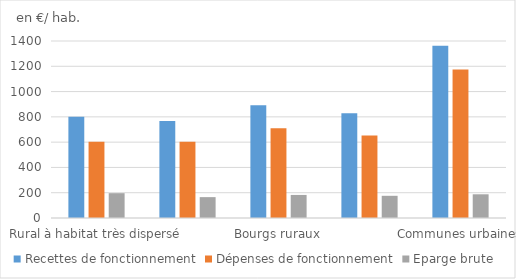
| Category | Recettes de fonctionnement | Dépenses de fonctionnement | Eparge brute  |
|---|---|---|---|
| Rural à habitat très dispersé | 800.128 | 603.805 | 196.322 |
| Rural à habitat dispersé | 768.212 | 603.143 | 165.069 |
| Bourgs ruraux | 892.539 | 710.143 | 182.395 |
| Ensemble communes rurales | 827.612 | 652.041 | 175.572 |
| Communes urbaines | 1361.628 | 1174.07 | 187.558 |